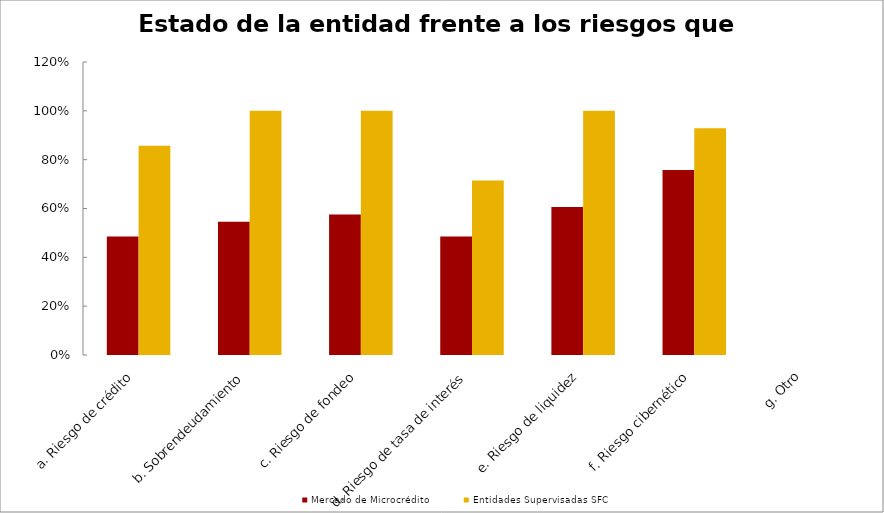
| Category | Mercado de Microcrédito | Entidades Supervisadas SFC |
|---|---|---|
| a. Riesgo de crédito | 0.485 | 0.857 |
| b. Sobrendeudamiento | 0.545 | 1 |
| c. Riesgo de fondeo | 0.576 | 1 |
| d. Riesgo de tasa de interés | 0.485 | 0.714 |
| e. Riesgo de liquidez | 0.606 | 1 |
| f. Riesgo cibernético | 0.758 | 0.929 |
| g. Otro | 0 | 0 |